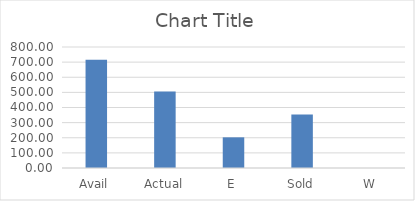
| Category | Series 0 |
|---|---|
| Avail | 715.8 |
| Actual | 506.43 |
| E | 202.77 |
| Sold | 352.9 |
| W | 0 |